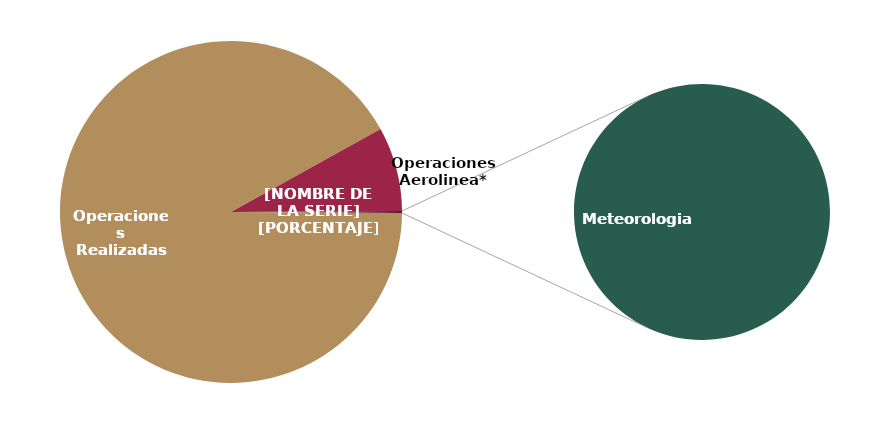
| Category | Cancelaciones |
|---|---|
| Operaciones Realizadas | 1982 |
|    Operaciones Aerolinea* | 172 |
|    Tripulaciones* | 0 |
|    Otras Imputables | 0 |
|    Meteorologia | 4 |